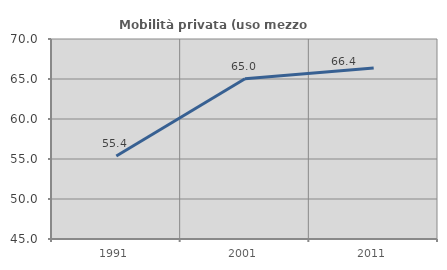
| Category | Mobilità privata (uso mezzo privato) |
|---|---|
| 1991.0 | 55.369 |
| 2001.0 | 65.031 |
| 2011.0 | 66.372 |